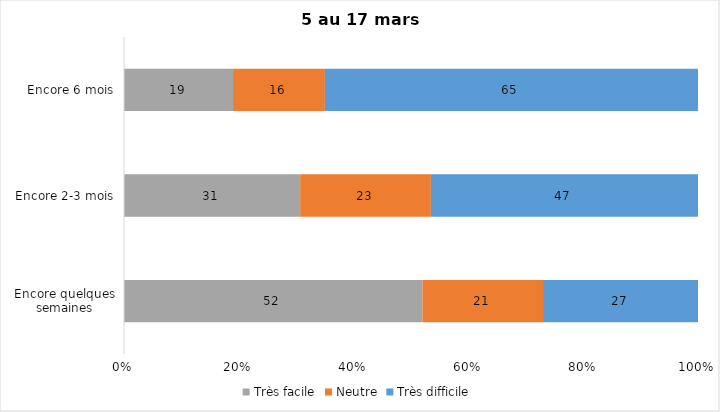
| Category | Très facile | Neutre | Très difficile |
|---|---|---|---|
| Encore quelques semaines | 52 | 21 | 27 |
| Encore 2-3 mois | 31 | 23 | 47 |
| Encore 6 mois | 19 | 16 | 65 |